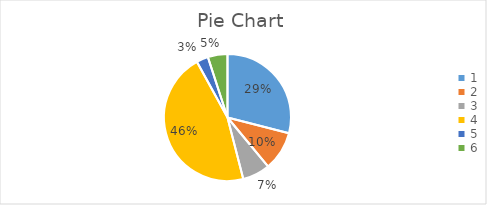
| Category | Series 0 |
|---|---|
| 0 | 29 |
| 1 | 10 |
| 2 | 7 |
| 3 | 46 |
| 4 | 3 |
| 5 | 5 |